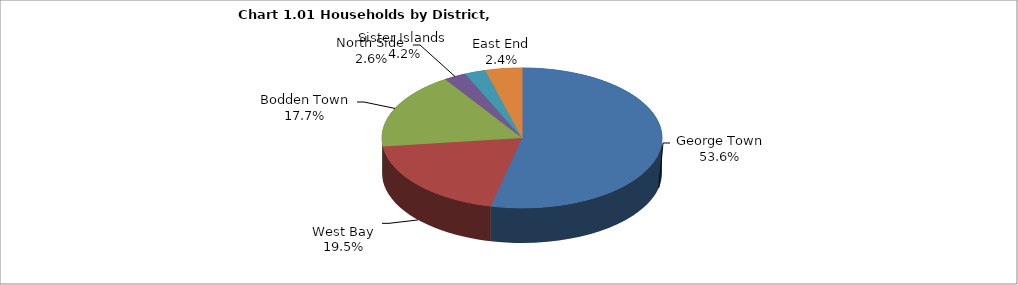
| Category | Series 0 |
|---|---|
| George Town | 13497 |
| West Bay | 4913 |
| Bodden Town | 4466 |
| North Side | 644 |
| East End | 611 |
| Sister Islands  | 1066 |